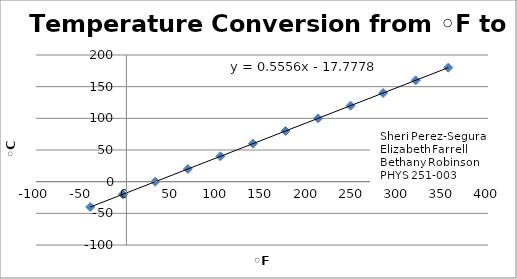
| Category | F to C |
|---|---|
| -40.0 | -40 |
| -4.0 | -20 |
| 32.0 | 0 |
| 68.0 | 20 |
| 104.0 | 40 |
| 140.0 | 60 |
| 176.0 | 80 |
| 212.0 | 100 |
| 248.0 | 120 |
| 284.0 | 140 |
| 320.0 | 160 |
| 356.0 | 180 |